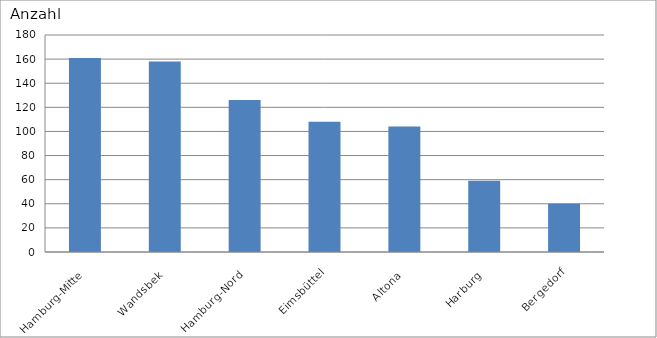
| Category | Hamburg-Mitte Wandsbek Hamburg-Nord Eimsbüttel Altona Harburg Bergedorf |
|---|---|
| Hamburg-Mitte | 161 |
| Wandsbek | 158 |
| Hamburg-Nord | 126 |
| Eimsbüttel | 108 |
| Altona | 104 |
| Harburg | 59 |
| Bergedorf | 40 |